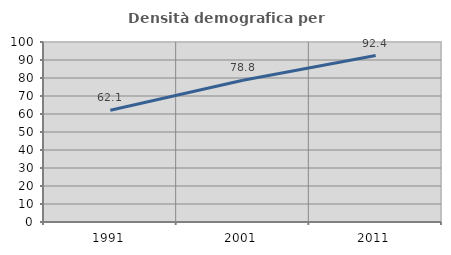
| Category | Densità demografica |
|---|---|
| 1991.0 | 62.088 |
| 2001.0 | 78.751 |
| 2011.0 | 92.447 |